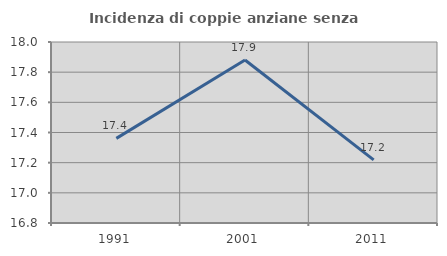
| Category | Incidenza di coppie anziane senza figli  |
|---|---|
| 1991.0 | 17.361 |
| 2001.0 | 17.881 |
| 2011.0 | 17.219 |